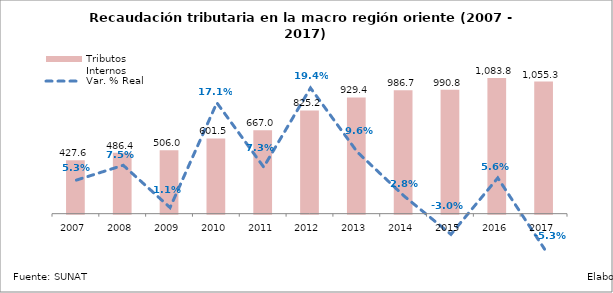
| Category | Tributos Internos |
|---|---|
| 2007.0 | 427.581 |
| 2008.0 | 486.417 |
| 2009.0 | 506.04 |
| 2010.0 | 601.548 |
| 2011.0 | 666.989 |
| 2012.0 | 825.175 |
| 2013.0 | 929.391 |
| 2014.0 | 986.652 |
| 2015.0 | 990.766 |
| 2016.0 | 1083.844 |
| 2017.0 | 1055.335 |